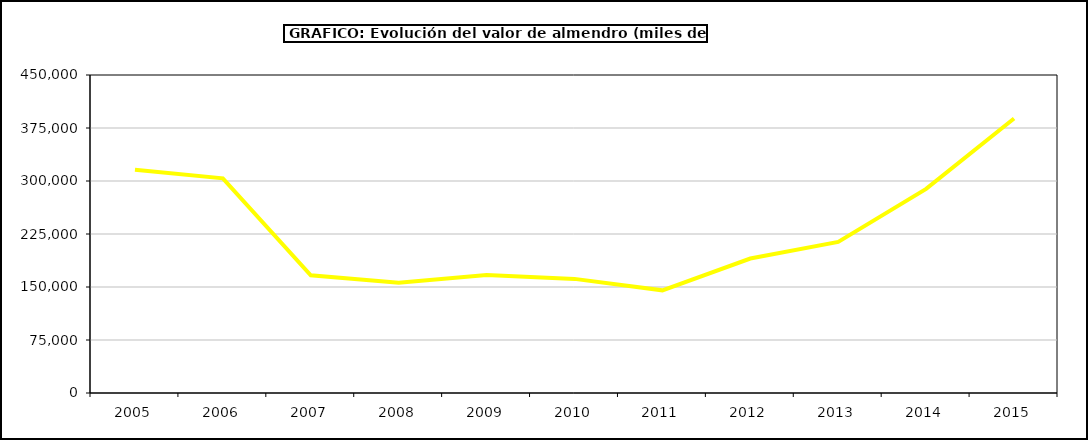
| Category | valor almendro |
|---|---|
| 2005.0 | 315910.05 |
| 2006.0 | 303821.263 |
| 2007.0 | 166525.934 |
| 2008.0 | 156005.219 |
| 2009.0 | 166823.782 |
| 2010.0 | 161485.094 |
| 2011.0 | 145270.034 |
| 2012.0 | 190305.336 |
| 2013.0 | 213791.63 |
| 2014.0 | 288832.154 |
| 2015.0 | 388475 |